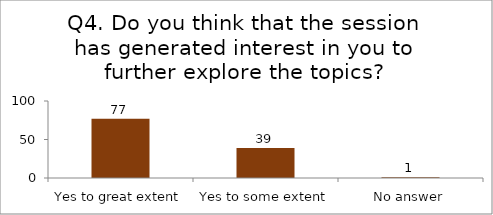
| Category | Q4. Do you think that the session has generated interest in you to further explore the topics? |
|---|---|
| Yes to great extent | 77 |
| Yes to some extent | 39 |
| No answer | 1 |